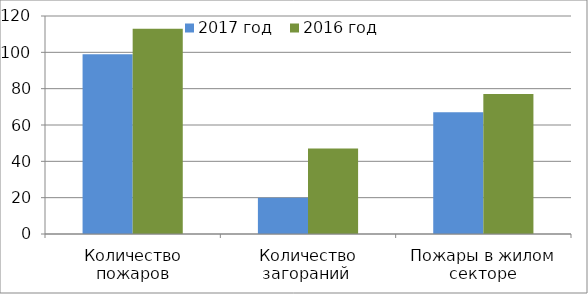
| Category | 2017 год | 2016 год |
|---|---|---|
| Количество пожаров | 99 | 113 |
| Количество загораний  | 20 | 47 |
| Пожары в жилом секторе | 67 | 77 |